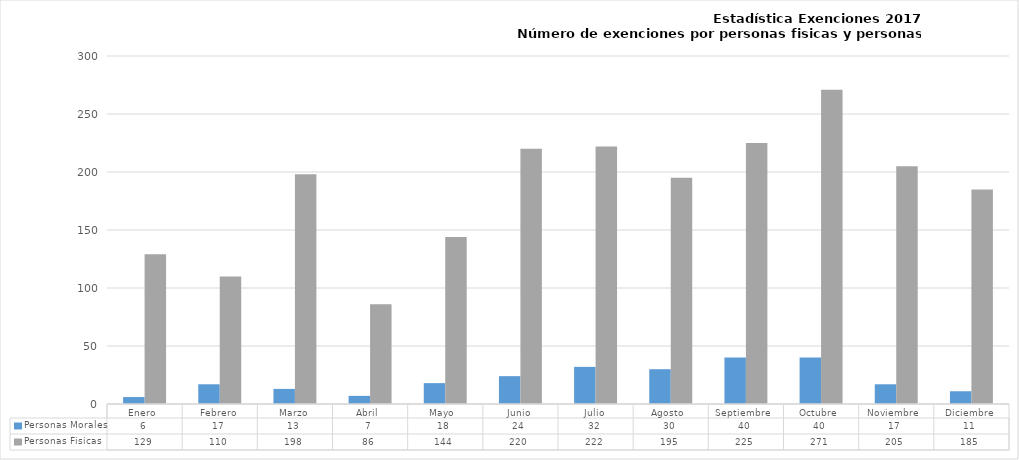
| Category | Personas Morales | Personas Fisicas |
|---|---|---|
| Enero  | 6 | 129 |
| Febrero | 17 | 110 |
| Marzo | 13 | 198 |
| Abril  | 7 | 86 |
| Mayo  | 18 | 144 |
| Junio | 24 | 220 |
| Julio | 32 | 222 |
| Agosto  | 30 | 195 |
| Septiembre  | 40 | 225 |
| Octubre  | 40 | 271 |
| Noviembre  | 17 | 205 |
| Diciembre | 11 | 185 |